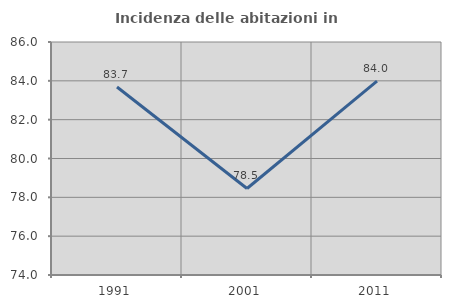
| Category | Incidenza delle abitazioni in proprietà  |
|---|---|
| 1991.0 | 83.681 |
| 2001.0 | 78.455 |
| 2011.0 | 83.981 |